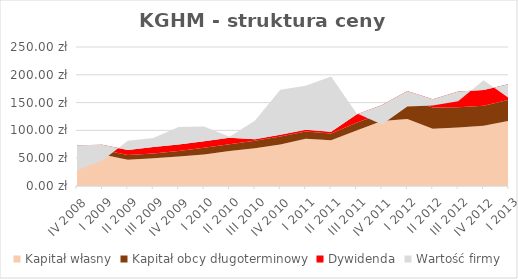
| Category | Kapitał własny | Kapitał obcy długoterminowy | Dywidenda | Wartość firmy |
|---|---|---|---|---|
| IV 2008 | 54.914 | 9.246 | 9 | -45.041 |
| I 2009 | 56.765 | 8.609 | 9 | -28.684 |
| II 2009 | 47.079 | 8.643 | 9 | 16.778 |
| III 2009 | 49.727 | 8.883 | 11.68 | 16.11 |
| IV 2009 | 53.012 | 9.927 | 11.68 | 31.381 |
| I 2010 | 56.873 | 11.86 | 11.68 | 26.488 |
| II 2010 | 62.847 | 12.031 | 11.68 | 2.042 |
| III 2010 | 68.044 | 13.129 | 3 | 33.128 |
| IV 2010 | 74.611 | 14.579 | 3 | 80.811 |
| I 2011 | 84.778 | 13.37 | 3 | 79.052 |
| II 2011 | 82.14 | 12.454 | 3 | 99.406 |
| III 2011 | 99.974 | 13.647 | 14.9 | 2.479 |
| IV 2011 | 116.912 | 14.032 | 14.9 | -35.244 |
| I 2012 | 120.624 | 35.494 | 14.9 | -27.918 |
| II 2012 | 103.129 | 37.89 | 14.9 | -10.919 |
| III 2012 | 105.089 | 36.437 | 28.34 | -17.366 |
| IV 2012 | 108.55 | 35.6 | 28.34 | 17.51 |
| I 2013 | 117.3 | 37.83 | 28.34 | -25.67 |